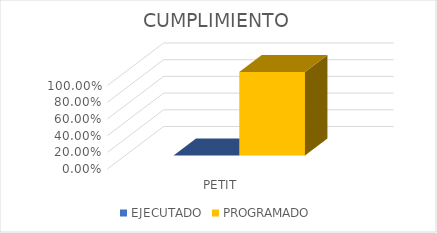
| Category | EJECUTADO | PROGRAMADO |
|---|---|---|
| PETIT | 0 | 1 |